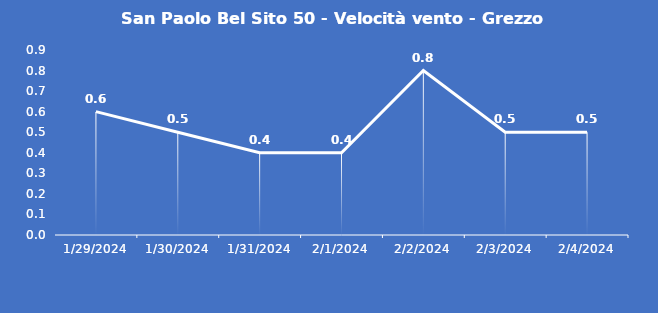
| Category | San Paolo Bel Sito 50 - Velocità vento - Grezzo (m/s) |
|---|---|
| 1/29/24 | 0.6 |
| 1/30/24 | 0.5 |
| 1/31/24 | 0.4 |
| 2/1/24 | 0.4 |
| 2/2/24 | 0.8 |
| 2/3/24 | 0.5 |
| 2/4/24 | 0.5 |